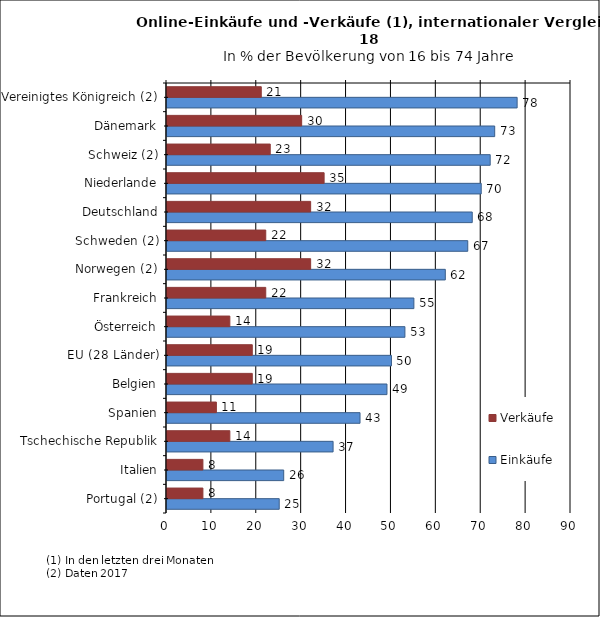
| Category | Einkäufe | Verkäufe |
|---|---|---|
| Portugal (2) | 25 | 8 |
| Italien | 26 | 8 |
| Tschechische Republik | 37 | 14 |
| Spanien | 43 | 11 |
| Belgien | 49 | 19 |
| EU (28 Länder) | 50 | 19 |
| Österreich | 53 | 14 |
| Frankreich | 55 | 22 |
| Norwegen (2) | 62 | 32 |
| Schweden (2) | 67 | 22 |
| Deutschland | 68 | 32 |
| Niederlande | 70 | 35 |
| Schweiz (2) | 72 | 23 |
| Dänemark | 73 | 30 |
| Vereinigtes Königreich (2) | 78 | 21 |